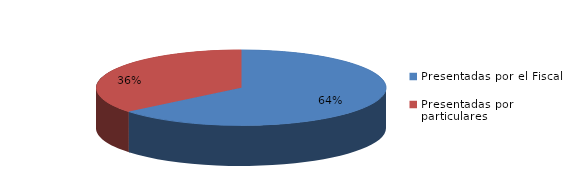
| Category | Series 0 |
|---|---|
| Presentadas por el Fiscal | 164 |
| Presentadas por particulares | 92 |